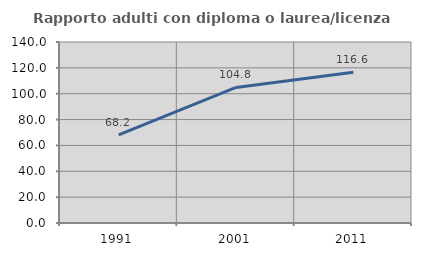
| Category | Rapporto adulti con diploma o laurea/licenza media  |
|---|---|
| 1991.0 | 68.232 |
| 2001.0 | 104.829 |
| 2011.0 | 116.562 |